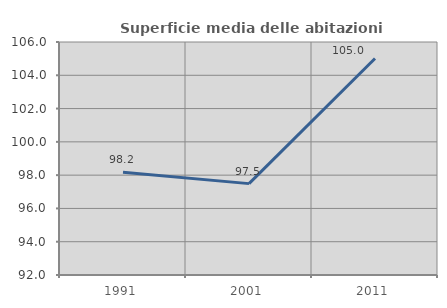
| Category | Superficie media delle abitazioni occupate |
|---|---|
| 1991.0 | 98.17 |
| 2001.0 | 97.49 |
| 2011.0 | 105.005 |